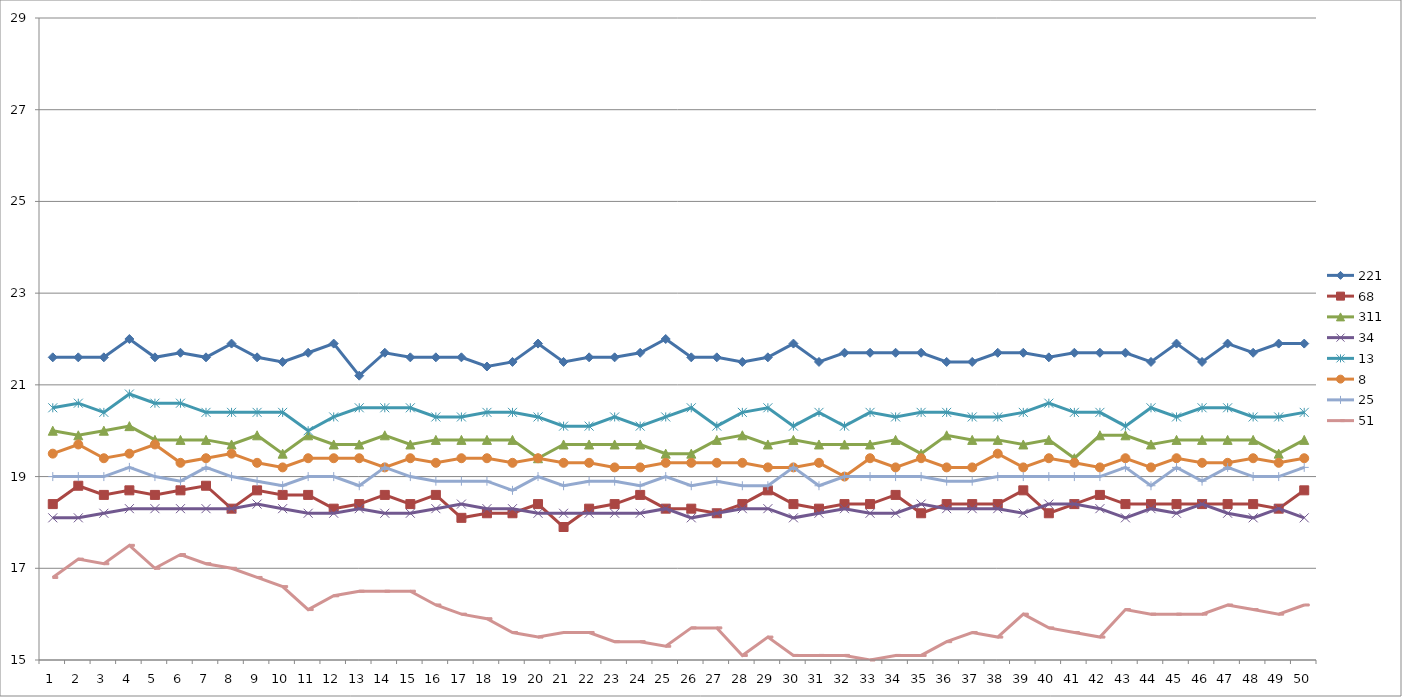
| Category | 221 | 68 | 311 | 34 | 13 | 8 | 25 | 51 |
|---|---|---|---|---|---|---|---|---|
| 0 | 21.6 | 18.4 | 20 | 18.1 | 20.5 | 19.5 | 19 | 16.8 |
| 1 | 21.6 | 18.8 | 19.9 | 18.1 | 20.6 | 19.7 | 19 | 17.2 |
| 2 | 21.6 | 18.6 | 20 | 18.2 | 20.4 | 19.4 | 19 | 17.1 |
| 3 | 22 | 18.7 | 20.1 | 18.3 | 20.8 | 19.5 | 19.2 | 17.5 |
| 4 | 21.6 | 18.6 | 19.8 | 18.3 | 20.6 | 19.7 | 19 | 17 |
| 5 | 21.7 | 18.7 | 19.8 | 18.3 | 20.6 | 19.3 | 18.9 | 17.3 |
| 6 | 21.6 | 18.8 | 19.8 | 18.3 | 20.4 | 19.4 | 19.2 | 17.1 |
| 7 | 21.9 | 18.3 | 19.7 | 18.3 | 20.4 | 19.5 | 19 | 17 |
| 8 | 21.6 | 18.7 | 19.9 | 18.4 | 20.4 | 19.3 | 18.9 | 16.8 |
| 9 | 21.5 | 18.6 | 19.5 | 18.3 | 20.4 | 19.2 | 18.8 | 16.6 |
| 10 | 21.7 | 18.6 | 19.9 | 18.2 | 20 | 19.4 | 19 | 16.1 |
| 11 | 21.9 | 18.3 | 19.7 | 18.2 | 20.3 | 19.4 | 19 | 16.4 |
| 12 | 21.2 | 18.4 | 19.7 | 18.3 | 20.5 | 19.4 | 18.8 | 16.5 |
| 13 | 21.7 | 18.6 | 19.9 | 18.2 | 20.5 | 19.2 | 19.2 | 16.5 |
| 14 | 21.6 | 18.4 | 19.7 | 18.2 | 20.5 | 19.4 | 19 | 16.5 |
| 15 | 21.6 | 18.6 | 19.8 | 18.3 | 20.3 | 19.3 | 18.9 | 16.2 |
| 16 | 21.6 | 18.1 | 19.8 | 18.4 | 20.3 | 19.4 | 18.9 | 16 |
| 17 | 21.4 | 18.2 | 19.8 | 18.3 | 20.4 | 19.4 | 18.9 | 15.9 |
| 18 | 21.5 | 18.2 | 19.8 | 18.3 | 20.4 | 19.3 | 18.7 | 15.6 |
| 19 | 21.9 | 18.4 | 19.4 | 18.2 | 20.3 | 19.4 | 19 | 15.5 |
| 20 | 21.5 | 17.9 | 19.7 | 18.2 | 20.1 | 19.3 | 18.8 | 15.6 |
| 21 | 21.6 | 18.3 | 19.7 | 18.2 | 20.1 | 19.3 | 18.9 | 15.6 |
| 22 | 21.6 | 18.4 | 19.7 | 18.2 | 20.3 | 19.2 | 18.9 | 15.4 |
| 23 | 21.7 | 18.6 | 19.7 | 18.2 | 20.1 | 19.2 | 18.8 | 15.4 |
| 24 | 22 | 18.3 | 19.5 | 18.3 | 20.3 | 19.3 | 19 | 15.3 |
| 25 | 21.6 | 18.3 | 19.5 | 18.1 | 20.5 | 19.3 | 18.8 | 15.7 |
| 26 | 21.6 | 18.2 | 19.8 | 18.2 | 20.1 | 19.3 | 18.9 | 15.7 |
| 27 | 21.5 | 18.4 | 19.9 | 18.3 | 20.4 | 19.3 | 18.8 | 15.1 |
| 28 | 21.6 | 18.7 | 19.7 | 18.3 | 20.5 | 19.2 | 18.8 | 15.5 |
| 29 | 21.9 | 18.4 | 19.8 | 18.1 | 20.1 | 19.2 | 19.2 | 15.1 |
| 30 | 21.5 | 18.3 | 19.7 | 18.2 | 20.4 | 19.3 | 18.8 | 15.1 |
| 31 | 21.7 | 18.4 | 19.7 | 18.3 | 20.1 | 19 | 19 | 15.1 |
| 32 | 21.7 | 18.4 | 19.7 | 18.2 | 20.4 | 19.4 | 19 | 15 |
| 33 | 21.7 | 18.6 | 19.8 | 18.2 | 20.3 | 19.2 | 19 | 15.1 |
| 34 | 21.7 | 18.2 | 19.5 | 18.4 | 20.4 | 19.4 | 19 | 15.1 |
| 35 | 21.5 | 18.4 | 19.9 | 18.3 | 20.4 | 19.2 | 18.9 | 15.4 |
| 36 | 21.5 | 18.4 | 19.8 | 18.3 | 20.3 | 19.2 | 18.9 | 15.6 |
| 37 | 21.7 | 18.4 | 19.8 | 18.3 | 20.3 | 19.5 | 19 | 15.5 |
| 38 | 21.7 | 18.7 | 19.7 | 18.2 | 20.4 | 19.2 | 19 | 16 |
| 39 | 21.6 | 18.2 | 19.8 | 18.4 | 20.6 | 19.4 | 19 | 15.7 |
| 40 | 21.7 | 18.4 | 19.4 | 18.4 | 20.4 | 19.3 | 19 | 15.6 |
| 41 | 21.7 | 18.6 | 19.9 | 18.3 | 20.4 | 19.2 | 19 | 15.5 |
| 42 | 21.7 | 18.4 | 19.9 | 18.1 | 20.1 | 19.4 | 19.2 | 16.1 |
| 43 | 21.5 | 18.4 | 19.7 | 18.3 | 20.5 | 19.2 | 18.8 | 16 |
| 44 | 21.9 | 18.4 | 19.8 | 18.2 | 20.3 | 19.4 | 19.2 | 16 |
| 45 | 21.5 | 18.4 | 19.8 | 18.4 | 20.5 | 19.3 | 18.9 | 16 |
| 46 | 21.9 | 18.4 | 19.8 | 18.2 | 20.5 | 19.3 | 19.2 | 16.2 |
| 47 | 21.7 | 18.4 | 19.8 | 18.1 | 20.3 | 19.4 | 19 | 16.1 |
| 48 | 21.9 | 18.3 | 19.5 | 18.3 | 20.3 | 19.3 | 19 | 16 |
| 49 | 21.9 | 18.7 | 19.8 | 18.1 | 20.4 | 19.4 | 19.2 | 16.2 |